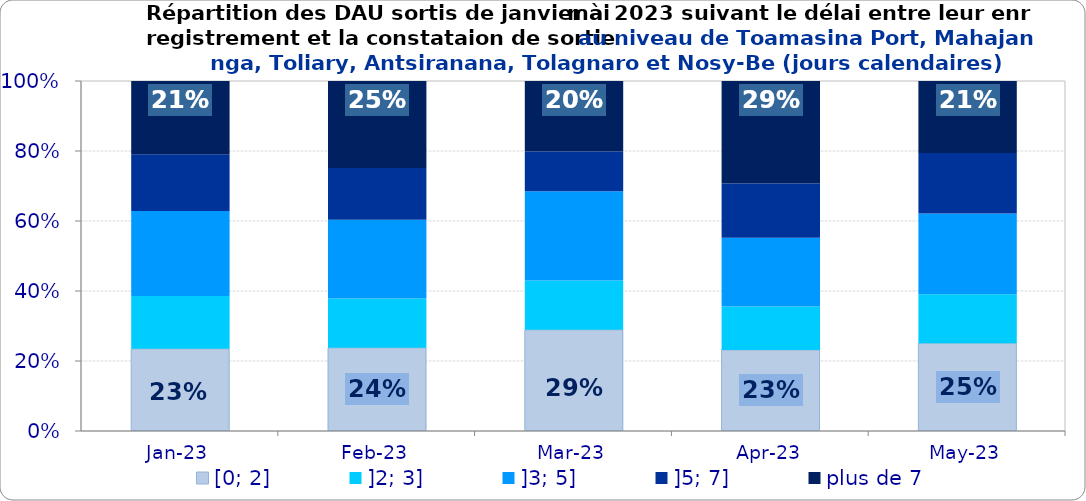
| Category | [0; 2] | ]2; 3] | ]3; 5] | ]5; 7] | plus de 7 |
|---|---|---|---|---|---|
| 2023-01-01 | 0.235 | 0.151 | 0.243 | 0.162 | 0.21 |
| 2023-02-01 | 0.238 | 0.141 | 0.225 | 0.148 | 0.248 |
| 2023-03-01 | 0.289 | 0.141 | 0.255 | 0.114 | 0.201 |
| 2023-04-01 | 0.231 | 0.124 | 0.196 | 0.155 | 0.293 |
| 2023-05-01 | 0.251 | 0.14 | 0.23 | 0.173 | 0.205 |